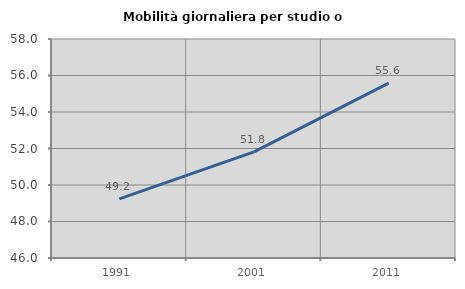
| Category | Mobilità giornaliera per studio o lavoro |
|---|---|
| 1991.0 | 49.239 |
| 2001.0 | 51.813 |
| 2011.0 | 55.578 |